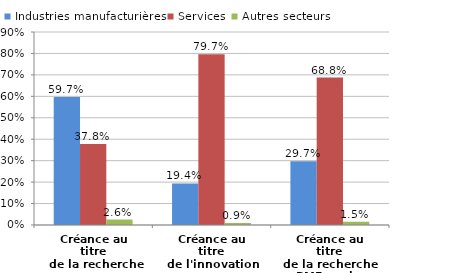
| Category | Industries manufacturières | Services | Autres secteurs |
|---|---|---|---|
| Créance au titre
 de la recherche | 0.597 | 0.378 | 0.026 |
| Créance au titre
de l'innovation | 0.194 | 0.796 | 0.009 |
| Créance au titre
de la recherche
PME seules | 0.297 | 0.688 | 0.015 |